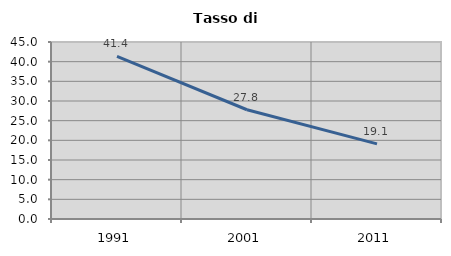
| Category | Tasso di disoccupazione   |
|---|---|
| 1991.0 | 41.359 |
| 2001.0 | 27.778 |
| 2011.0 | 19.103 |